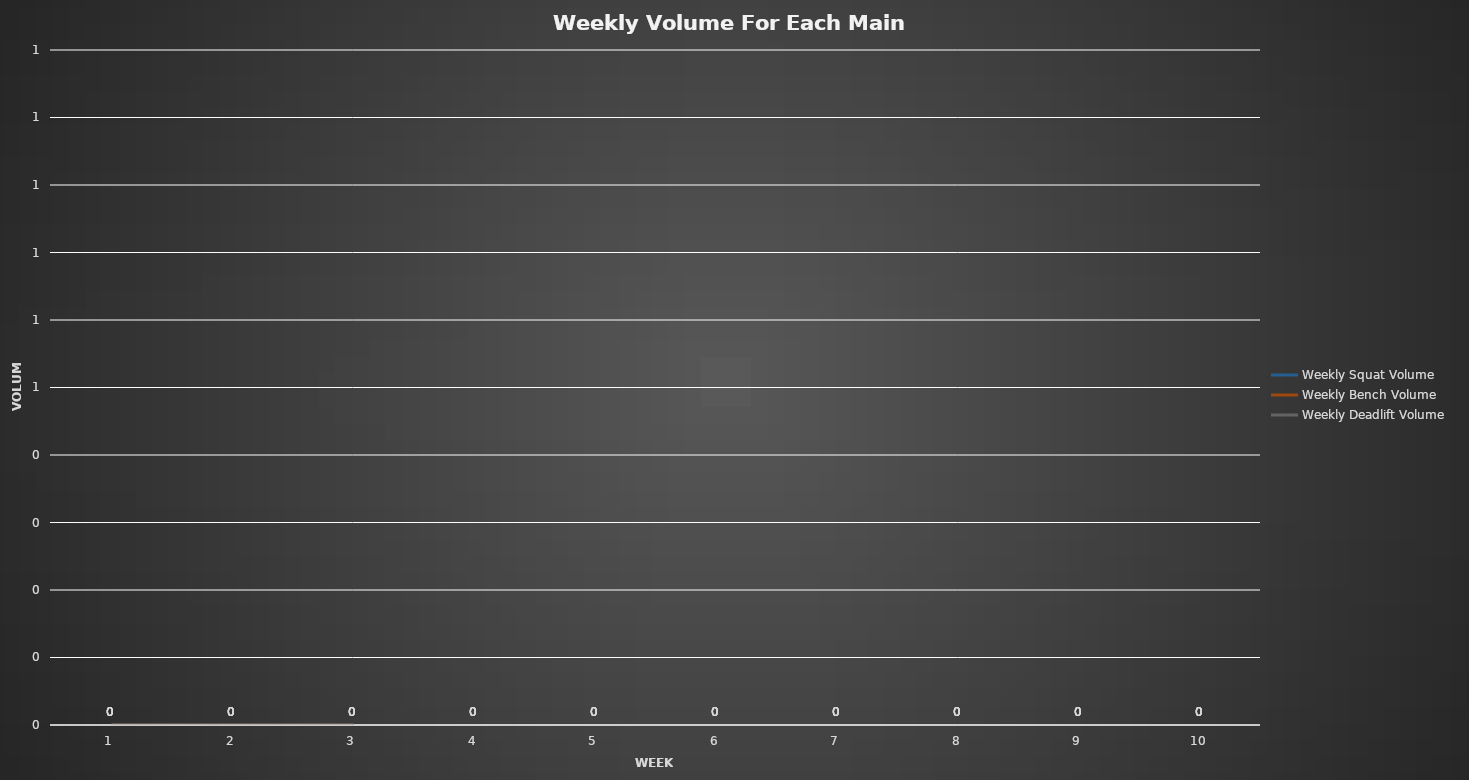
| Category | Weekly Squat Volume | Weekly Bench Volume | Weekly Deadlift Volume |
|---|---|---|---|
| 0 | 0 | 0 | 0 |
| 1 | 0 | 0 | 0 |
| 2 | 0 | 0 | 0 |
| 3 | 0 | 0 | 0 |
| 4 | 0 | 0 | 0 |
| 5 | 0 | 0 | 0 |
| 6 | 0 | 0 | 0 |
| 7 | 0 | 0 | 0 |
| 8 | 0 | 0 | 0 |
| 9 | 0 | 0 | 0 |